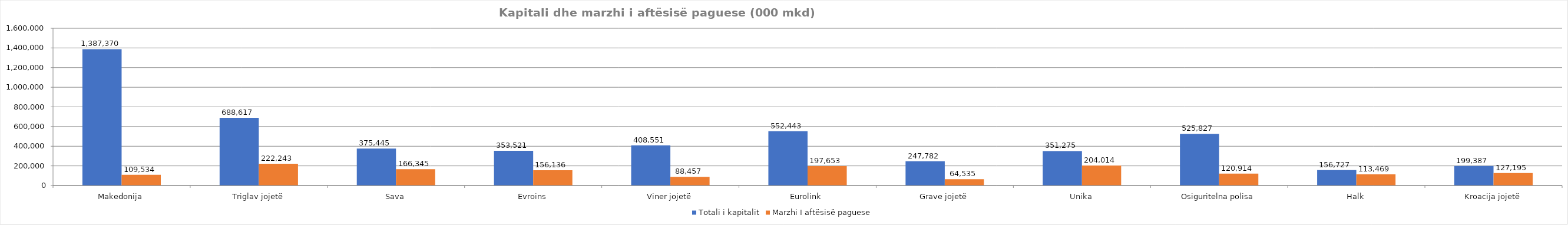
| Category | Totali i kapitalit | Marzhi I aftësisë paguese |
|---|---|---|
| Makedonija | 1387370 | 109534 |
| Triglav jojetë | 688617 | 222243 |
| Sava | 375445 | 166345 |
| Evroins | 353521 | 156136 |
| Viner jojetë | 408551 | 88457 |
| Eurolink | 552443 | 197653 |
| Grave jojetë | 247782 | 64535 |
| Unika | 351275 | 204014 |
| Osiguritelna polisa | 525827 | 120914 |
| Halk | 156727 | 113469 |
| Kroacija jojetë | 199387 | 127195 |